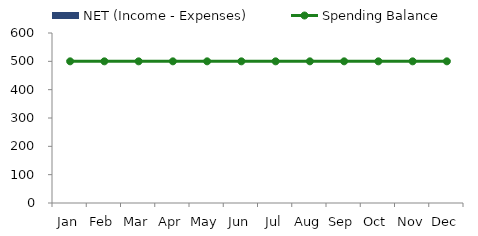
| Category | NET (Income - Expenses) |
|---|---|
| Jan | 0 |
| Feb | 0 |
| Mar | 0 |
| Apr | 0 |
| May | 0 |
| Jun | 0 |
| Jul | 0 |
| Aug | 0 |
| Sep | 0 |
| Oct | 0 |
| Nov | 0 |
| Dec | 0 |